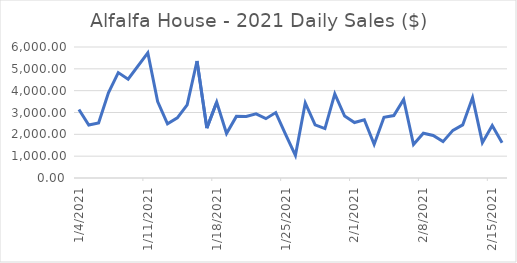
| Category | Series 0 |
|---|---|
| 1/4/21 | 3137.33 |
| 1/5/21 | 2423.92 |
| 1/6/21 | 2524.94 |
| 1/7/21 | 3898.93 |
| 1/8/21 | 4826.98 |
| 1/9/21 | 4528.23 |
| 1/11/21 | 5733.11 |
| 1/12/21 | 3501.19 |
| 1/13/21 | 2481.36 |
| 1/14/21 | 2754.99 |
| 1/15/21 | 3350.85 |
| 1/16/21 | 5360.82 |
| 1/17/21 | 2285.51 |
| 1/18/21 | 3473.29 |
| 1/19/21 | 2038.65 |
| 1/20/21 | 2821.91 |
| 1/21/21 | 2813.98 |
| 1/22/21 | 2937.16 |
| 1/23/21 | 2717.93 |
| 1/24/21 | 2997.26 |
| 1/25/21 | 1999.23 |
| 1/26/21 | 1034.34 |
| 1/27/21 | 3440.91 |
| 1/28/21 | 2435.99 |
| 1/29/21 | 2263.25 |
| 1/30/21 | 3856.97 |
| 1/31/21 | 2837.06 |
| 2/1/21 | 2539.56 |
| 2/2/21 | 2668.33 |
| 2/3/21 | 1538.52 |
| 2/4/21 | 2779.96 |
| 2/5/21 | 2859.01 |
| 2/6/21 | 3600.44 |
| 2/7/21 | 1533.83 |
| 2/8/21 | 2050.15 |
| 2/9/21 | 1945.93 |
| 2/10/21 | 1666.03 |
| 2/11/21 | 2183.94 |
| 2/12/21 | 2430.18 |
| 2/13/21 | 3683 |
| 2/14/21 | 1619.99 |
| 2/15/21 | 2399.38 |
| 2/16/21 | 1619.31 |